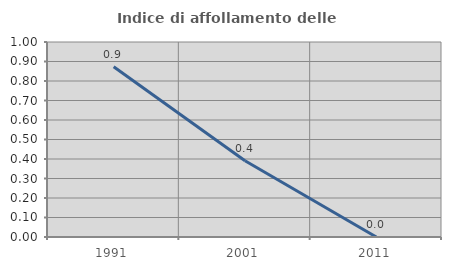
| Category | Indice di affollamento delle abitazioni  |
|---|---|
| 1991.0 | 0.873 |
| 2001.0 | 0.391 |
| 2011.0 | 0 |